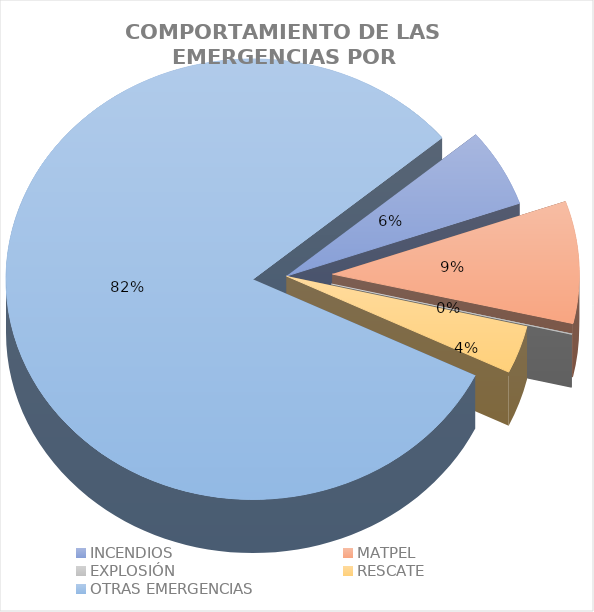
| Category | Series 0 |
|---|---|
| INCENDIOS | 0.057 |
| MATPEL | 0.09 |
| EXPLOSIÓN | 0.001 |
| RESCATE | 0.035 |
| OTRAS EMERGENCIAS | 0.817 |